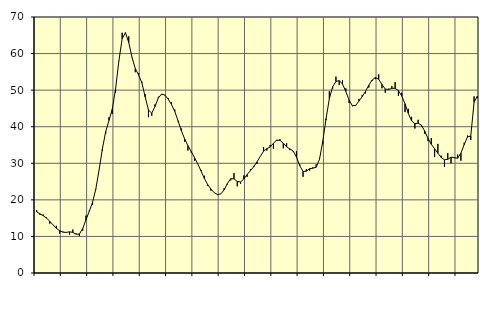
| Category | Piggar | Series 1 |
|---|---|---|
| nan | 17.2 | 16.74 |
| 87.0 | 15.9 | 16.19 |
| 87.0 | 16 | 15.67 |
| 87.0 | 15.2 | 15.03 |
| nan | 13.5 | 14.12 |
| 88.0 | 13.1 | 13.16 |
| 88.0 | 12.9 | 12.21 |
| 88.0 | 10.8 | 11.57 |
| nan | 11.3 | 11.16 |
| 89.0 | 11.2 | 11.11 |
| 89.0 | 10.5 | 11.26 |
| 89.0 | 11.9 | 11.1 |
| nan | 10.8 | 10.61 |
| 90.0 | 10.1 | 10.65 |
| 90.0 | 11.6 | 12.15 |
| 90.0 | 15.7 | 14.55 |
| nan | 17.1 | 16.88 |
| 91.0 | 18.6 | 19.32 |
| 91.0 | 22.9 | 23 |
| 91.0 | 28.3 | 28.25 |
| nan | 33.4 | 34.02 |
| 92.0 | 38.1 | 38.66 |
| 92.0 | 42.6 | 41.72 |
| 92.0 | 43.5 | 44.8 |
| nan | 49.3 | 50.37 |
| 93.0 | 58 | 57.94 |
| 93.0 | 65.7 | 64.07 |
| 93.0 | 65.6 | 65.72 |
| nan | 64.7 | 63.04 |
| 94.0 | 58.9 | 58.97 |
| 94.0 | 54.9 | 55.88 |
| 94.0 | 54.7 | 54.17 |
| nan | 52.3 | 52 |
| 95.0 | 48.9 | 48.16 |
| 95.0 | 42.6 | 44.56 |
| 95.0 | 43 | 43.71 |
| nan | 46.1 | 45.54 |
| 96.0 | 48.2 | 47.88 |
| 96.0 | 48.7 | 48.92 |
| 96.0 | 48.7 | 48.63 |
| nan | 47.8 | 47.56 |
| 97.0 | 46.7 | 46.06 |
| 97.0 | 44.7 | 44.18 |
| 97.0 | 41.4 | 41.62 |
| nan | 39.5 | 38.94 |
| 98.0 | 35.9 | 36.66 |
| 98.0 | 33.5 | 34.81 |
| 98.0 | 32.9 | 33.23 |
| nan | 30.7 | 31.56 |
| 99.0 | 29.8 | 29.81 |
| 99.0 | 28.1 | 27.87 |
| 99.0 | 26.6 | 25.85 |
| nan | 23.8 | 24.19 |
| 0.0 | 22.5 | 22.96 |
| 0.0 | 22 | 21.96 |
| 0.0 | 21.4 | 21.44 |
| nan | 21.6 | 21.63 |
| 1.0 | 23.2 | 22.71 |
| 1.0 | 24.2 | 24.47 |
| 1.0 | 25.3 | 25.78 |
| nan | 27.3 | 25.76 |
| 2.0 | 23.7 | 25.01 |
| 2.0 | 24.4 | 24.9 |
| 2.0 | 26.7 | 25.7 |
| nan | 26.3 | 26.93 |
| 3.0 | 28.4 | 28 |
| 3.0 | 29.3 | 29.04 |
| 3.0 | 29.8 | 30.39 |
| nan | 31.9 | 31.88 |
| 4.0 | 34.4 | 33.3 |
| 4.0 | 33.5 | 34.01 |
| 4.0 | 35 | 34.47 |
| nan | 33.9 | 35.48 |
| 5.0 | 36.1 | 36.34 |
| 5.0 | 36.6 | 36.27 |
| 5.0 | 34.1 | 35.5 |
| nan | 35.5 | 34.52 |
| 6.0 | 33.6 | 33.93 |
| 6.0 | 33.2 | 33.36 |
| 6.0 | 33.3 | 31.71 |
| nan | 29.7 | 29.33 |
| 7.0 | 26.3 | 27.75 |
| 7.0 | 28.4 | 27.83 |
| 7.0 | 28 | 28.53 |
| nan | 28.9 | 28.65 |
| 8.0 | 29.7 | 28.93 |
| 8.0 | 31.4 | 31.1 |
| 8.0 | 35.2 | 36.01 |
| nan | 41.8 | 42.21 |
| 9.0 | 49.7 | 47.71 |
| 9.0 | 50.4 | 50.9 |
| 9.0 | 53.7 | 52.36 |
| nan | 51.4 | 52.61 |
| 10.0 | 52.7 | 51.65 |
| 10.0 | 50.5 | 49.65 |
| 10.0 | 46.5 | 47.29 |
| nan | 45.6 | 45.73 |
| 11.0 | 45.7 | 45.82 |
| 11.0 | 47.6 | 47.01 |
| 11.0 | 48.7 | 48.24 |
| nan | 49.1 | 49.69 |
| 12.0 | 50.7 | 51.35 |
| 12.0 | 52.5 | 52.75 |
| 12.0 | 53 | 53.47 |
| nan | 54.3 | 52.96 |
| 13.0 | 50.5 | 51.56 |
| 13.0 | 49.3 | 50.29 |
| 13.0 | 50.4 | 50.18 |
| nan | 51.1 | 50.51 |
| 14.0 | 52.2 | 50.51 |
| 14.0 | 48.4 | 49.86 |
| 14.0 | 49.3 | 48.4 |
| nan | 44 | 46.28 |
| 15.0 | 44.9 | 43.66 |
| 15.0 | 42.7 | 41.6 |
| 15.0 | 39.5 | 40.85 |
| nan | 41.9 | 40.95 |
| 16.0 | 40.1 | 40.41 |
| 16.0 | 38.1 | 38.79 |
| 16.0 | 36.1 | 36.79 |
| nan | 36.9 | 35.19 |
| 17.0 | 31.7 | 33.99 |
| 17.0 | 35.3 | 32.74 |
| 17.0 | 32.1 | 31.6 |
| nan | 29 | 30.96 |
| 18.0 | 32.8 | 31.09 |
| 18.0 | 30 | 31.67 |
| 18.0 | 31.7 | 31.51 |
| nan | 32.4 | 31.38 |
| 19.0 | 30.7 | 32.77 |
| 19.0 | 35.6 | 35.1 |
| 19.0 | 37.6 | 37.21 |
| nan | 36.4 | 37.46 |
| 20.0 | 48.3 | 46.69 |
| 20.0 | 47.8 | 48.34 |